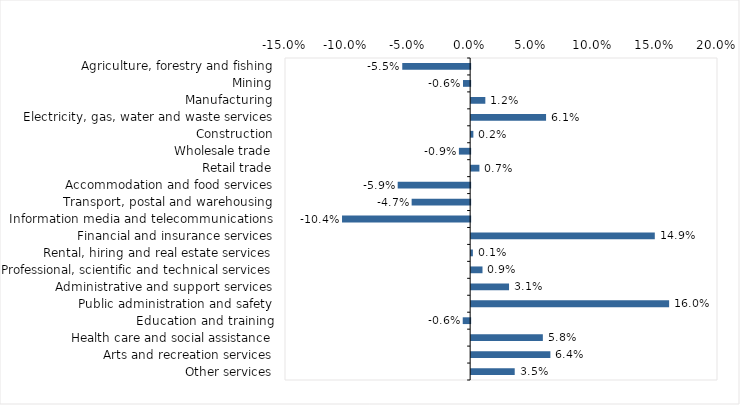
| Category | This week |
|---|---|
| Agriculture, forestry and fishing | -0.055 |
| Mining | -0.006 |
| Manufacturing | 0.012 |
| Electricity, gas, water and waste services | 0.061 |
| Construction | 0.002 |
| Wholesale trade | -0.009 |
| Retail trade | 0.007 |
| Accommodation and food services | -0.059 |
| Transport, postal and warehousing | -0.047 |
| Information media and telecommunications | -0.104 |
| Financial and insurance services | 0.149 |
| Rental, hiring and real estate services | 0.001 |
| Professional, scientific and technical services | 0.009 |
| Administrative and support services | 0.031 |
| Public administration and safety | 0.16 |
| Education and training | -0.006 |
| Health care and social assistance | 0.058 |
| Arts and recreation services | 0.064 |
| Other services | 0.035 |